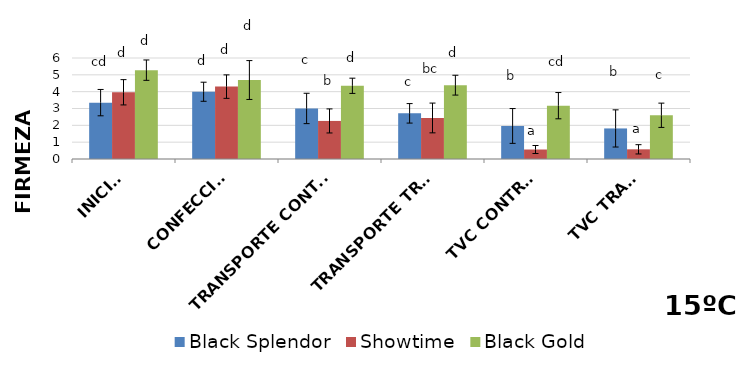
| Category | Black Splendor | Showtime | Black Gold |
|---|---|---|---|
| INICIAL | 3.348 | 3.963 | 5.278 |
| CONFECCIÓN | 3.995 | 4.3 | 4.692 |
| TRANSPORTE CONTROL | 3.003 | 2.261 | 4.349 |
| TRANSPORTE TRAT. | 2.712 | 2.438 | 4.386 |
| TVC CONTROL | 1.962 | 0.564 | 3.168 |
| TVC TRAT. | 1.815 | 0.575 | 2.598 |